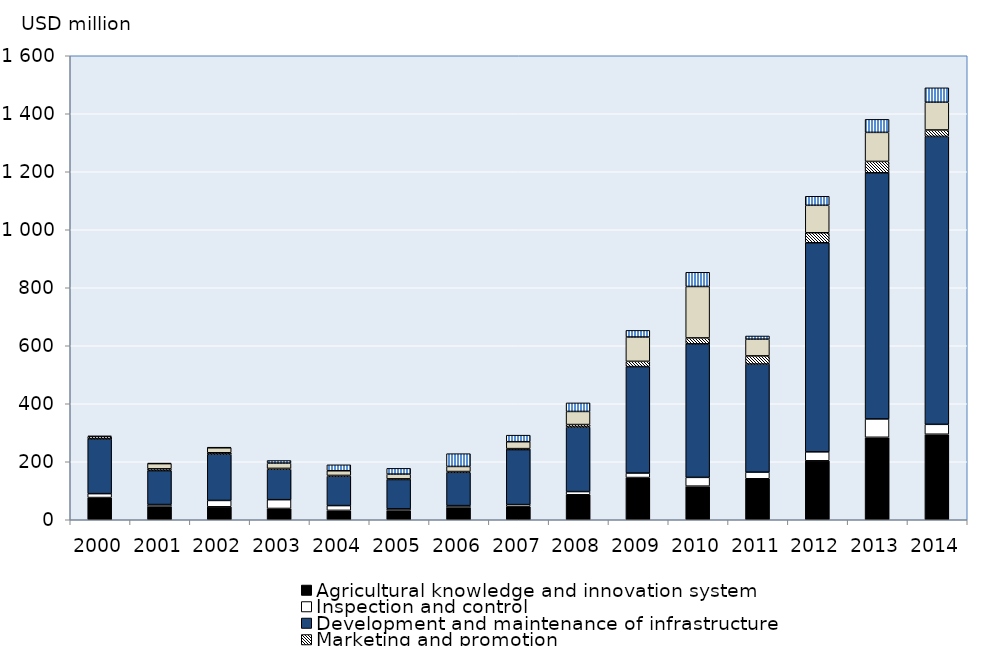
| Category | Agricultural knowledge and innovation system | Inspection and control | Development and maintenance of infrastructure | Marketing and promotion | Cost of public stockholding | Miscellaneous |
|---|---|---|---|---|---|---|
| 2000.0 | 76.524 | 13.552 | 188.87 | 7.991 | 0 | 1.937 |
| 2001.0 | 46.946 | 5.577 | 116.853 | 6.227 | 18.02 | 1.387 |
| 2002.0 | 44.67 | 21.954 | 160.031 | 4.342 | 17.479 | 0.969 |
| 2003.0 | 38.943 | 30.31 | 105.219 | 2.671 | 18.228 | 8.893 |
| 2004.0 | 32.369 | 16.478 | 101.554 | 2.483 | 16.06 | 20.528 |
| 2005.0 | 32.627 | 4.899 | 101.24 | 2.309 | 16.338 | 19.859 |
| 2006.0 | 43.676 | 5.122 | 114.761 | 2.716 | 17.539 | 44.089 |
| 2007.0 | 45.174 | 7.119 | 189.615 | 3.374 | 23.836 | 22.563 |
| 2008.0 | 86.13 | 11.048 | 222.721 | 8.434 | 45.123 | 29.527 |
| 2009.0 | 145.54 | 15.572 | 366.988 | 18.189 | 83.893 | 22.843 |
| 2010.0 | 115.908 | 30.283 | 460.346 | 20.528 | 177.346 | 48.984 |
| 2011.0 | 141.3 | 22.874 | 372.83 | 28.077 | 57.719 | 10.841 |
| 2012.0 | 203.338 | 30.841 | 721.039 | 34.452 | 94.722 | 31.095 |
| 2013.0 | 284.35 | 63.411 | 848.613 | 39.292 | 100.127 | 44.963 |
| 2014.0 | 294.96 | 34.086 | 992.927 | 22.127 | 95.731 | 49.632 |